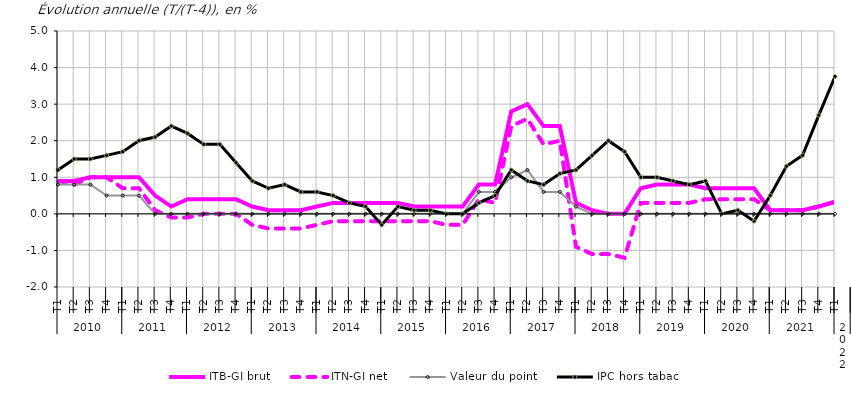
| Category | ITB-GI brut | ITN-GI net | Valeur du point | IPC hors tabac |
|---|---|---|---|---|
| 0 | 0.9 | 0.9 | 0.8 | 1.2 |
| 1 | 0.9 | 0.8 | 0.8 | 1.5 |
| 2 | 1 | 1 | 0.8 | 1.5 |
| 3 | 1 | 1 | 0.5 | 1.6 |
| 4 | 1 | 0.7 | 0.5 | 1.7 |
| 5 | 1 | 0.7 | 0.5 | 2 |
| 6 | 0.5 | 0.1 | 0 | 2.1 |
| 7 | 0.2 | -0.1 | 0 | 2.4 |
| 8 | 0.4 | -0.1 | 0 | 2.2 |
| 9 | 0.4 | 0 | 0 | 1.9 |
| 10 | 0.4 | 0 | 0 | 1.9 |
| 11 | 0.4 | 0 | 0 | 1.4 |
| 12 | 0.2 | -0.3 | 0 | 0.9 |
| 13 | 0.1 | -0.4 | 0 | 0.7 |
| 14 | 0.1 | -0.4 | 0 | 0.8 |
| 15 | 0.1 | -0.4 | 0 | 0.6 |
| 16 | 0.2 | -0.3 | 0 | 0.6 |
| 17 | 0.3 | -0.2 | 0 | 0.5 |
| 18 | 0.3 | -0.2 | 0 | 0.3 |
| 19 | 0.3 | -0.2 | 0 | 0.2 |
| 20 | 0.3 | -0.2 | 0 | -0.3 |
| 21 | 0.3 | -0.2 | 0 | 0.2 |
| 22 | 0.2 | -0.2 | 0 | 0.1 |
| 23 | 0.2 | -0.2 | 0 | 0.1 |
| 24 | 0.2 | -0.3 | 0 | 0 |
| 25 | 0.2 | -0.3 | 0 | 0 |
| 26 | 0.8 | 0.4 | 0.6 | 0.3 |
| 27 | 0.8 | 0.3 | 0.6 | 0.5 |
| 28 | 2.8 | 2.4 | 1 | 1.2 |
| 29 | 3 | 2.6 | 1.2 | 0.9 |
| 30 | 2.4 | 1.9 | 0.6 | 0.8 |
| 31 | 2.4 | 2 | 0.6 | 1.1 |
| 32 | 0.3 | -0.9 | 0.2 | 1.2 |
| 33 | 0.1 | -1.1 | 0 | 1.6 |
| 34 | 0 | -1.1 | 0 | 2 |
| 35 | 0 | -1.2 | 0 | 1.7 |
| 36 | 0.7 | 0.3 | 0 | 1 |
| 37 | 0.8 | 0.3 | 0 | 1 |
| 38 | 0.8 | 0.3 | 0 | 0.9 |
| 39 | 0.8 | 0.3 | 0 | 0.8 |
| 40 | 0.7 | 0.4 | 0 | 0.9 |
| 41 | 0.7 | 0.4 | 0 | 0 |
| 42 | 0.7 | 0.4 | 0 | 0.1 |
| 43 | 0.7 | 0.4 | 0 | -0.2 |
| 44 | 0.1 | 0.1 | 0 | 0.5 |
| 45 | 0.1 | 0.1 | 0 | 1.3 |
| 46 | 0.1 | 0.1 | 0 | 1.6 |
| 47 | 0.2 | 0.2 | 0 | 2.7 |
| 48 | 0.329 | 0.329 | 0 | 3.756 |